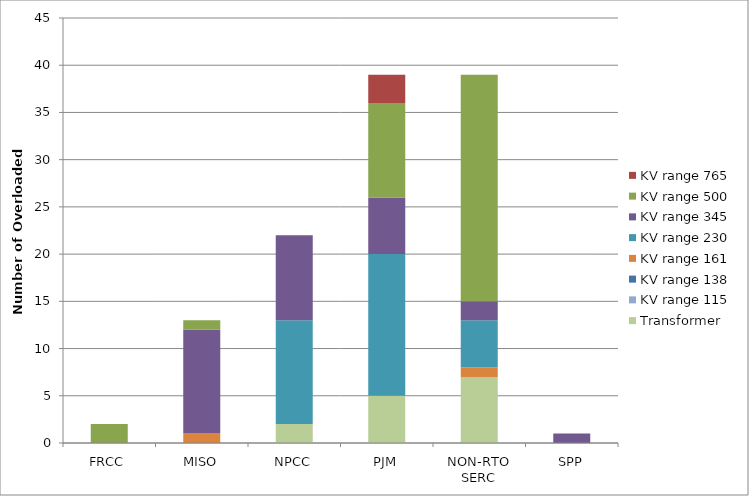
| Category | Transformer | KV range 115 | KV range 138 | KV range 161 | KV range 230 | KV range 345 | KV range 500 | KV range 765 |
|---|---|---|---|---|---|---|---|---|
| FRCC | 0 | 0 | 0 | 0 | 0 | 0 | 2 | 0 |
| MISO | 0 | 0 | 0 | 1 | 0 | 11 | 1 | 0 |
| NPCC | 2 | 0 | 0 | 0 | 11 | 9 | 0 | 0 |
| PJM | 5 | 0 | 0 | 0 | 15 | 6 | 10 | 3 |
| NON-RTO SERC | 7 | 0 | 0 | 1 | 5 | 2 | 24 | 0 |
| SPP | 0 | 0 | 0 | 0 | 0 | 1 | 0 | 0 |